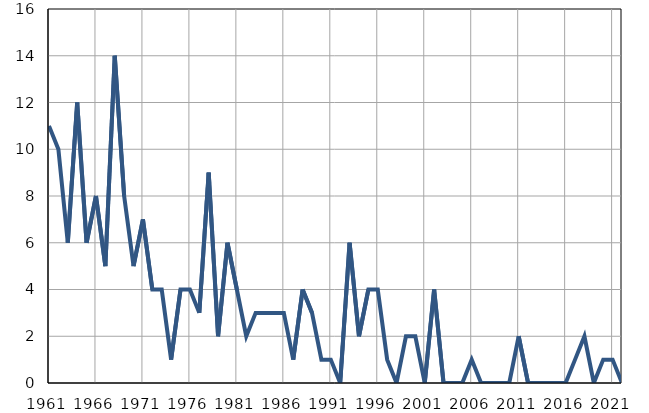
| Category | Умрла 
одојчад |
|---|---|
| 1961.0 | 11 |
| 1962.0 | 10 |
| 1963.0 | 6 |
| 1964.0 | 12 |
| 1965.0 | 6 |
| 1966.0 | 8 |
| 1967.0 | 5 |
| 1968.0 | 14 |
| 1969.0 | 8 |
| 1970.0 | 5 |
| 1971.0 | 7 |
| 1972.0 | 4 |
| 1973.0 | 4 |
| 1974.0 | 1 |
| 1975.0 | 4 |
| 1976.0 | 4 |
| 1977.0 | 3 |
| 1978.0 | 9 |
| 1979.0 | 2 |
| 1980.0 | 6 |
| 1981.0 | 4 |
| 1982.0 | 2 |
| 1983.0 | 3 |
| 1984.0 | 3 |
| 1985.0 | 3 |
| 1986.0 | 3 |
| 1987.0 | 1 |
| 1988.0 | 4 |
| 1989.0 | 3 |
| 1990.0 | 1 |
| 1991.0 | 1 |
| 1992.0 | 0 |
| 1993.0 | 6 |
| 1994.0 | 2 |
| 1995.0 | 4 |
| 1996.0 | 4 |
| 1997.0 | 1 |
| 1998.0 | 0 |
| 1999.0 | 2 |
| 2000.0 | 2 |
| 2001.0 | 0 |
| 2002.0 | 4 |
| 2003.0 | 0 |
| 2004.0 | 0 |
| 2005.0 | 0 |
| 2006.0 | 1 |
| 2007.0 | 0 |
| 2008.0 | 0 |
| 2009.0 | 0 |
| 2010.0 | 0 |
| 2011.0 | 2 |
| 2012.0 | 0 |
| 2013.0 | 0 |
| 2014.0 | 0 |
| 2015.0 | 0 |
| 2016.0 | 0 |
| 2017.0 | 1 |
| 2018.0 | 2 |
| 2019.0 | 0 |
| 2020.0 | 1 |
| 2021.0 | 1 |
| 2022.0 | 0 |